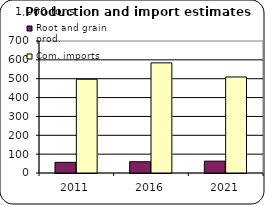
| Category | Root and grain prod. | Com. imports |
|---|---|---|
| 2011.0 | 56.556 | 497.397 |
| 2016.0 | 59.67 | 584.145 |
| 2021.0 | 62.867 | 509.215 |